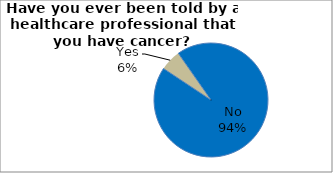
| Category | Series 0 |
|---|---|
| No | 94.041 |
| Yes | 5.959 |